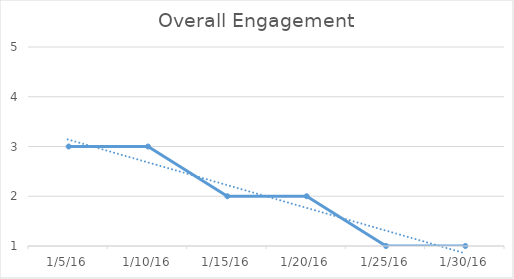
| Category | Series 0 |
|---|---|
| 1/5/16 | 3 |
| 1/10/16 | 3 |
| 1/15/16 | 2 |
| 1/20/16 | 2 |
| 1/25/16 | 1 |
| 1/30/16 | 1 |